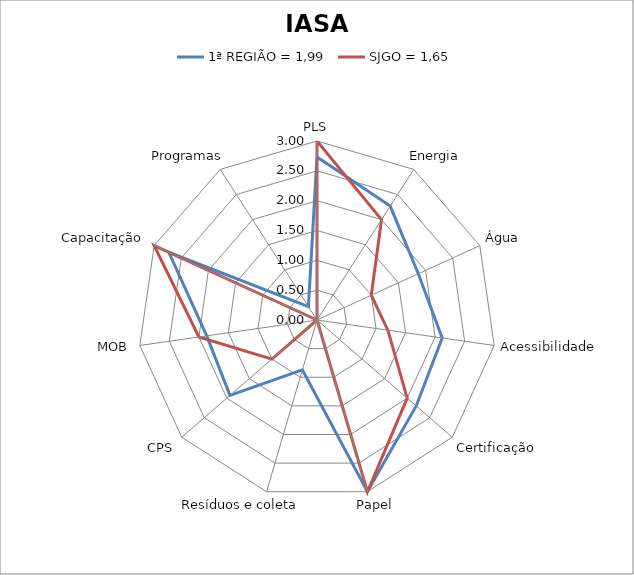
| Category | 1ª REGIÃO = 1,99 | SJGO = 1,65 |
|---|---|---|
| PLS | 2.73 | 3 |
| Energia | 2.27 | 2 |
| Água | 1.867 | 1 |
| Acessibilidade | 2.12 | 1.2 |
| Certificação | 2.2 | 2 |
| Papel | 3 | 3 |
| Resíduos e coleta | 0.87 | 0 |
| CPS | 1.93 | 1 |
| MOB | 1.867 | 2 |
| Capacitação | 2.73 | 3 |
| Programas | 0.267 | 0 |